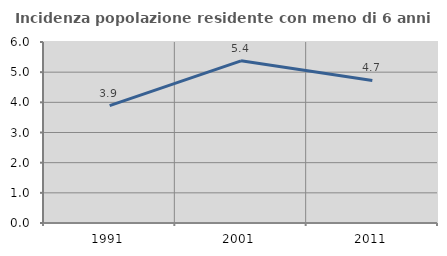
| Category | Incidenza popolazione residente con meno di 6 anni |
|---|---|
| 1991.0 | 3.889 |
| 2001.0 | 5.375 |
| 2011.0 | 4.724 |